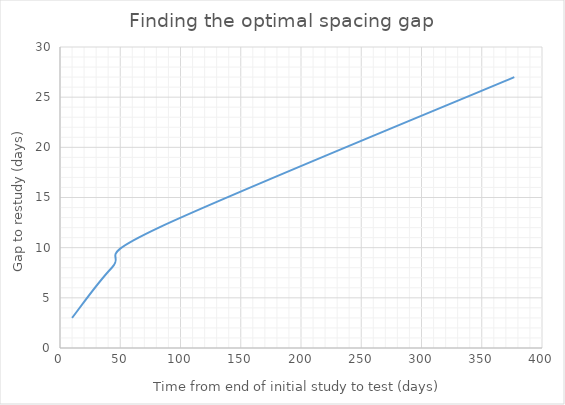
| Category | Series 0 |
|---|---|
| 10.0 | 3 |
| 43.0 | 8 |
| 82.0 | 12 |
| 377.0 | 27 |